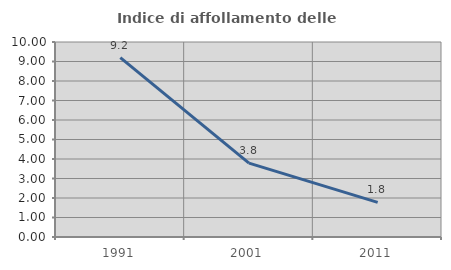
| Category | Indice di affollamento delle abitazioni  |
|---|---|
| 1991.0 | 9.194 |
| 2001.0 | 3.785 |
| 2011.0 | 1.775 |